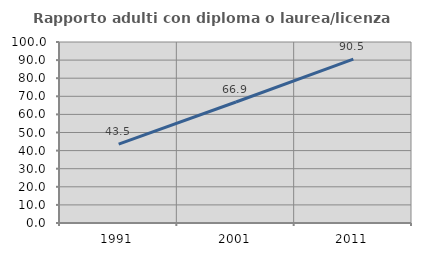
| Category | Rapporto adulti con diploma o laurea/licenza media  |
|---|---|
| 1991.0 | 43.537 |
| 2001.0 | 66.851 |
| 2011.0 | 90.5 |